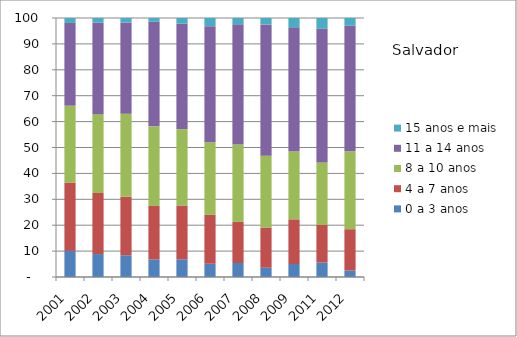
| Category | 0 a 3 anos | 4 a 7 anos | 8 a 10 anos | 11 a 14 anos | 15 anos e mais |
|---|---|---|---|---|---|
| 2001.0 | 10.08 | 26.41 | 29.66 | 31.94 | 1.9 |
| 2002.0 | 8.86 | 23.57 | 30.45 | 35.31 | 1.81 |
| 2003.0 | 8.39 | 22.61 | 32.04 | 35.24 | 1.72 |
| 2004.0 | 6.75 | 20.68 | 30.74 | 40.37 | 1.46 |
| 2005.0 | 6.83 | 20.78 | 29.49 | 40.69 | 2.21 |
| 2006.0 | 5.11 | 18.87 | 28.03 | 44.85 | 3.15 |
| 2007.0 | 5.4 | 15.88 | 29.87 | 46.42 | 2.43 |
| 2008.0 | 3.57 | 15.54 | 27.75 | 50.67 | 2.46 |
| 2009.0 | 5.02 | 17.25 | 26.29 | 47.86 | 3.58 |
| 2011.0 | 5.59 | 14.48 | 24.16 | 51.68 | 4.09 |
| 2012.0 | 2.49 | 15.97 | 30.08 | 48.47 | 2.99 |